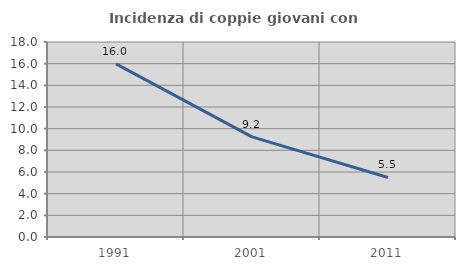
| Category | Incidenza di coppie giovani con figli |
|---|---|
| 1991.0 | 15.975 |
| 2001.0 | 9.246 |
| 2011.0 | 5.493 |